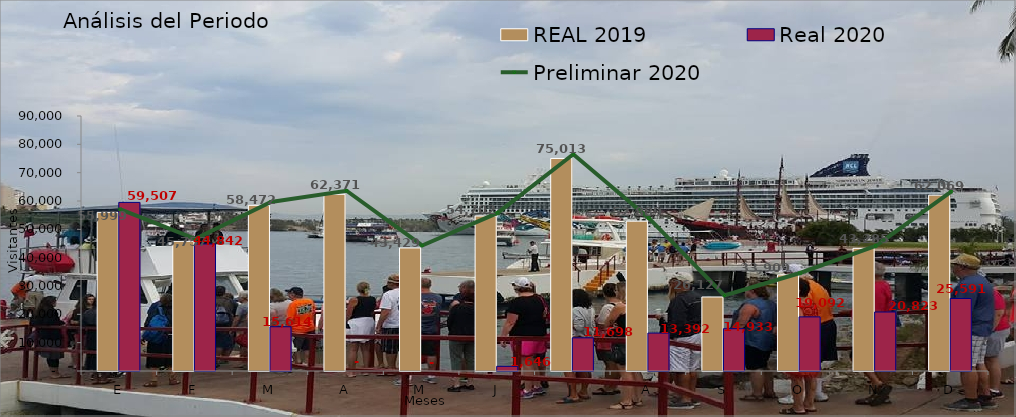
| Category | REAL 2019 | Real 2020 |
|---|---|---|
| E | 55999 | 59507 |
| F | 45757 | 44842 |
| M | 58472 | 15614 |
| A | 62371 | 0 |
| M | 43429 | 0 |
| J | 54702 | 1646 |
| J | 75013 | 11698 |
| A | 52889 | 13392 |
| S | 26127 | 14933 |
| O | 33909 | 19092 |
| N | 43285 | 20823 |
| D | 62069 | 25591 |